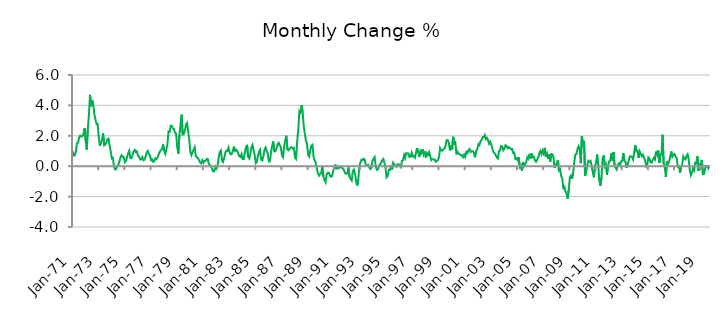
| Category | Series 0 |
|---|---|
| 1971-01-01 | 1.014 |
| 1971-02-01 | 0.711 |
| 1971-03-01 | 0.712 |
| 1971-04-01 | 0.919 |
| 1971-05-01 | 1.51 |
| 1971-06-01 | 1.551 |
| 1971-07-01 | 1.878 |
| 1971-08-01 | 2.005 |
| 1971-09-01 | 1.95 |
| 1971-10-01 | 1.987 |
| 1971-11-01 | 2.104 |
| 1971-12-01 | 2.509 |
| 1972-01-01 | 1.699 |
| 1972-02-01 | 1.094 |
| 1972-03-01 | 2.462 |
| 1972-04-01 | 3.36 |
| 1972-05-01 | 4.697 |
| 1972-06-01 | 3.937 |
| 1972-07-01 | 4.355 |
| 1972-08-01 | 4.026 |
| 1972-09-01 | 3.417 |
| 1972-10-01 | 3.088 |
| 1972-11-01 | 2.774 |
| 1972-12-01 | 2.784 |
| 1973-01-01 | 1.938 |
| 1973-02-01 | 1.343 |
| 1973-03-01 | 1.524 |
| 1973-04-01 | 1.712 |
| 1973-05-01 | 2.158 |
| 1973-06-01 | 1.373 |
| 1973-07-01 | 1.418 |
| 1973-08-01 | 1.551 |
| 1973-09-01 | 1.782 |
| 1973-10-01 | 1.816 |
| 1973-11-01 | 1.359 |
| 1973-12-01 | 0.961 |
| 1974-01-01 | 0.511 |
| 1974-02-01 | 0.548 |
| 1974-03-01 | -0.022 |
| 1974-04-01 | -0.216 |
| 1974-05-01 | -0.191 |
| 1974-06-01 | 0.007 |
| 1974-07-01 | 0.097 |
| 1974-08-01 | 0.326 |
| 1974-09-01 | 0.591 |
| 1974-10-01 | 0.722 |
| 1974-11-01 | 0.594 |
| 1974-12-01 | 0.583 |
| 1975-01-01 | 0.268 |
| 1975-02-01 | 0.337 |
| 1975-03-01 | 0.597 |
| 1975-04-01 | 0.845 |
| 1975-05-01 | 1.017 |
| 1975-06-01 | 0.539 |
| 1975-07-01 | 0.526 |
| 1975-08-01 | 0.722 |
| 1975-09-01 | 0.97 |
| 1975-10-01 | 1.067 |
| 1975-11-01 | 0.93 |
| 1975-12-01 | 0.985 |
| 1976-01-01 | 0.687 |
| 1976-02-01 | 0.643 |
| 1976-03-01 | 0.437 |
| 1976-04-01 | 0.463 |
| 1976-05-01 | 0.603 |
| 1976-06-01 | 0.392 |
| 1976-07-01 | 0.432 |
| 1976-08-01 | 0.636 |
| 1976-09-01 | 0.905 |
| 1976-10-01 | 1.011 |
| 1976-11-01 | 0.8 |
| 1976-12-01 | 0.709 |
| 1977-01-01 | 0.392 |
| 1977-02-01 | 0.448 |
| 1977-03-01 | 0.289 |
| 1977-04-01 | 0.338 |
| 1977-05-01 | 0.521 |
| 1977-06-01 | 0.47 |
| 1977-07-01 | 0.575 |
| 1977-08-01 | 0.784 |
| 1977-09-01 | 0.951 |
| 1977-10-01 | 1.061 |
| 1977-11-01 | 1.111 |
| 1977-12-01 | 1.434 |
| 1978-01-01 | 1.05 |
| 1978-02-01 | 0.811 |
| 1978-03-01 | 1.084 |
| 1978-04-01 | 1.443 |
| 1978-05-01 | 2.28 |
| 1978-06-01 | 2.255 |
| 1978-07-01 | 2.668 |
| 1978-08-01 | 2.665 |
| 1978-09-01 | 2.498 |
| 1978-10-01 | 2.424 |
| 1978-11-01 | 2.207 |
| 1978-12-01 | 2.133 |
| 1979-01-01 | 1.242 |
| 1979-02-01 | 0.823 |
| 1979-03-01 | 2.034 |
| 1979-04-01 | 2.732 |
| 1979-05-01 | 3.394 |
| 1979-06-01 | 2.083 |
| 1979-07-01 | 2.118 |
| 1979-08-01 | 2.335 |
| 1979-09-01 | 2.734 |
| 1979-10-01 | 2.841 |
| 1979-11-01 | 2.3 |
| 1979-12-01 | 1.747 |
| 1980-01-01 | 0.943 |
| 1980-02-01 | 0.726 |
| 1980-03-01 | 0.925 |
| 1980-04-01 | 1.073 |
| 1980-05-01 | 1.242 |
| 1980-06-01 | 0.656 |
| 1980-07-01 | 0.591 |
| 1980-08-01 | 0.543 |
| 1980-09-01 | 0.381 |
| 1980-10-01 | 0.243 |
| 1980-11-01 | 0.186 |
| 1980-12-01 | 0.395 |
| 1981-01-01 | 0.234 |
| 1981-02-01 | 0.354 |
| 1981-03-01 | 0.354 |
| 1981-04-01 | 0.474 |
| 1981-05-01 | 0.478 |
| 1981-06-01 | 0.161 |
| 1981-07-01 | 0.077 |
| 1981-08-01 | 0.019 |
| 1981-09-01 | -0.188 |
| 1981-10-01 | -0.344 |
| 1981-11-01 | -0.317 |
| 1981-12-01 | -0.035 |
| 1982-01-01 | -0.155 |
| 1982-02-01 | 0.068 |
| 1982-03-01 | 0.555 |
| 1982-04-01 | 0.929 |
| 1982-05-01 | 1.031 |
| 1982-06-01 | 0.372 |
| 1982-07-01 | 0.28 |
| 1982-08-01 | 0.532 |
| 1982-09-01 | 0.859 |
| 1982-10-01 | 1.012 |
| 1982-11-01 | 0.998 |
| 1982-12-01 | 1.225 |
| 1983-01-01 | 0.92 |
| 1983-02-01 | 0.783 |
| 1983-03-01 | 0.81 |
| 1983-04-01 | 0.995 |
| 1983-05-01 | 1.293 |
| 1983-06-01 | 1.001 |
| 1983-07-01 | 1.08 |
| 1983-08-01 | 1.015 |
| 1983-09-01 | 0.803 |
| 1983-10-01 | 0.652 |
| 1983-11-01 | 0.611 |
| 1983-12-01 | 0.798 |
| 1984-01-01 | 0.473 |
| 1984-02-01 | 0.478 |
| 1984-03-01 | 0.903 |
| 1984-04-01 | 1.241 |
| 1984-05-01 | 1.404 |
| 1984-06-01 | 0.614 |
| 1984-07-01 | 0.511 |
| 1984-08-01 | 0.774 |
| 1984-09-01 | 1.225 |
| 1984-10-01 | 1.401 |
| 1984-11-01 | 1.068 |
| 1984-12-01 | 0.734 |
| 1985-01-01 | 0.202 |
| 1985-02-01 | 0.279 |
| 1985-03-01 | 0.684 |
| 1985-04-01 | 0.954 |
| 1985-05-01 | 1.079 |
| 1985-06-01 | 0.413 |
| 1985-07-01 | 0.38 |
| 1985-08-01 | 0.656 |
| 1985-09-01 | 1.087 |
| 1985-10-01 | 1.228 |
| 1985-11-01 | 1.02 |
| 1985-12-01 | 0.807 |
| 1986-01-01 | 0.311 |
| 1986-02-01 | 0.317 |
| 1986-03-01 | 0.923 |
| 1986-04-01 | 1.322 |
| 1986-05-01 | 1.629 |
| 1986-06-01 | 0.97 |
| 1986-07-01 | 0.982 |
| 1986-08-01 | 1.161 |
| 1986-09-01 | 1.443 |
| 1986-10-01 | 1.536 |
| 1986-11-01 | 1.373 |
| 1986-12-01 | 1.263 |
| 1987-01-01 | 0.724 |
| 1987-02-01 | 0.595 |
| 1987-03-01 | 1.283 |
| 1987-04-01 | 1.705 |
| 1987-05-01 | 2.003 |
| 1987-06-01 | 1.108 |
| 1987-07-01 | 1.049 |
| 1987-08-01 | 1.142 |
| 1987-09-01 | 1.226 |
| 1987-10-01 | 1.253 |
| 1987-11-01 | 1.16 |
| 1987-12-01 | 1.188 |
| 1988-01-01 | 0.558 |
| 1988-02-01 | 0.478 |
| 1988-03-01 | 1.666 |
| 1988-04-01 | 2.466 |
| 1988-05-01 | 3.62 |
| 1988-06-01 | 3.526 |
| 1988-07-01 | 4.01 |
| 1988-08-01 | 3.546 |
| 1988-09-01 | 2.637 |
| 1988-10-01 | 2.133 |
| 1988-11-01 | 1.68 |
| 1988-12-01 | 1.467 |
| 1989-01-01 | 0.756 |
| 1989-02-01 | 0.634 |
| 1989-03-01 | 1.069 |
| 1989-04-01 | 1.347 |
| 1989-05-01 | 1.408 |
| 1989-06-01 | 0.607 |
| 1989-07-01 | 0.411 |
| 1989-08-01 | 0.192 |
| 1989-09-01 | -0.165 |
| 1989-10-01 | -0.462 |
| 1989-11-01 | -0.618 |
| 1989-12-01 | -0.507 |
| 1990-01-01 | -0.459 |
| 1990-02-01 | -0.019 |
| 1990-03-01 | -0.686 |
| 1990-04-01 | -0.897 |
| 1990-05-01 | -1.058 |
| 1990-06-01 | -0.51 |
| 1990-07-01 | -0.437 |
| 1990-08-01 | -0.428 |
| 1990-09-01 | -0.604 |
| 1990-10-01 | -0.695 |
| 1990-11-01 | -0.649 |
| 1990-12-01 | -0.278 |
| 1991-01-01 | -0.196 |
| 1991-02-01 | 0.105 |
| 1991-03-01 | -0.159 |
| 1991-04-01 | -0.105 |
| 1991-05-01 | -0.139 |
| 1991-06-01 | -0.062 |
| 1991-07-01 | -0.066 |
| 1991-08-01 | -0.093 |
| 1991-09-01 | -0.159 |
| 1991-10-01 | -0.285 |
| 1991-11-01 | -0.467 |
| 1991-12-01 | -0.497 |
| 1992-01-01 | -0.494 |
| 1992-02-01 | -0.076 |
| 1992-03-01 | -0.697 |
| 1992-04-01 | -0.848 |
| 1992-05-01 | -0.944 |
| 1992-06-01 | -0.312 |
| 1992-07-01 | -0.225 |
| 1992-08-01 | -0.473 |
| 1992-09-01 | -1.015 |
| 1992-10-01 | -1.272 |
| 1992-11-01 | -0.873 |
| 1992-12-01 | 0.026 |
| 1993-01-01 | 0.247 |
| 1993-02-01 | 0.437 |
| 1993-03-01 | 0.391 |
| 1993-04-01 | 0.487 |
| 1993-05-01 | 0.413 |
| 1993-06-01 | 0.047 |
| 1993-07-01 | 0.03 |
| 1993-08-01 | 0.082 |
| 1993-09-01 | -0.063 |
| 1993-10-01 | -0.18 |
| 1993-11-01 | -0.118 |
| 1993-12-01 | 0.35 |
| 1994-01-01 | 0.48 |
| 1994-02-01 | 0.595 |
| 1994-03-01 | -0.023 |
| 1994-04-01 | -0.241 |
| 1994-05-01 | -0.212 |
| 1994-06-01 | 0.019 |
| 1994-07-01 | 0.12 |
| 1994-08-01 | 0.247 |
| 1994-09-01 | 0.391 |
| 1994-10-01 | 0.472 |
| 1994-11-01 | 0.222 |
| 1994-12-01 | -0.131 |
| 1995-01-01 | -0.733 |
| 1995-02-01 | -0.635 |
| 1995-03-01 | -0.24 |
| 1995-04-01 | -0.251 |
| 1995-05-01 | 0.043 |
| 1995-06-01 | -0.212 |
| 1995-07-01 | 0.218 |
| 1995-08-01 | 0.097 |
| 1995-09-01 | 0.057 |
| 1995-10-01 | -0.036 |
| 1995-11-01 | 0.126 |
| 1995-12-01 | 0.123 |
| 1996-01-01 | 0.036 |
| 1996-02-01 | -0.061 |
| 1996-03-01 | 0.33 |
| 1996-04-01 | 0.389 |
| 1996-05-01 | 0.736 |
| 1996-06-01 | 0.535 |
| 1996-07-01 | 0.868 |
| 1996-08-01 | 0.833 |
| 1996-09-01 | 0.834 |
| 1996-10-01 | 0.603 |
| 1996-11-01 | 0.635 |
| 1996-12-01 | 0.892 |
| 1997-01-01 | 0.634 |
| 1997-02-01 | 0.672 |
| 1997-03-01 | 0.57 |
| 1997-04-01 | 0.919 |
| 1997-05-01 | 1.19 |
| 1997-06-01 | 0.893 |
| 1997-07-01 | 0.625 |
| 1997-08-01 | 0.99 |
| 1997-09-01 | 0.877 |
| 1997-10-01 | 1.126 |
| 1997-11-01 | 0.779 |
| 1997-12-01 | 0.981 |
| 1998-01-01 | 0.576 |
| 1998-02-01 | 0.861 |
| 1998-03-01 | 0.744 |
| 1998-04-01 | 0.917 |
| 1998-05-01 | 0.646 |
| 1998-06-01 | 0.394 |
| 1998-07-01 | 0.47 |
| 1998-08-01 | 0.438 |
| 1998-09-01 | 0.441 |
| 1998-10-01 | 0.291 |
| 1998-11-01 | 0.339 |
| 1998-12-01 | 0.406 |
| 1999-01-01 | 0.599 |
| 1999-02-01 | 1.189 |
| 1999-03-01 | 1.036 |
| 1999-04-01 | 1.017 |
| 1999-05-01 | 1.102 |
| 1999-06-01 | 1.154 |
| 1999-07-01 | 1.343 |
| 1999-08-01 | 1.715 |
| 1999-09-01 | 1.719 |
| 1999-10-01 | 1.552 |
| 1999-11-01 | 1.038 |
| 1999-12-01 | 1.38 |
| 2000-01-01 | 1.085 |
| 2000-02-01 | 1.936 |
| 2000-03-01 | 1.491 |
| 2000-04-01 | 1.566 |
| 2000-05-01 | 0.781 |
| 2000-06-01 | 0.949 |
| 2000-07-01 | 0.839 |
| 2000-08-01 | 0.775 |
| 2000-09-01 | 0.714 |
| 2000-10-01 | 0.729 |
| 2000-11-01 | 0.596 |
| 2000-12-01 | 0.754 |
| 2001-01-01 | 0.606 |
| 2001-02-01 | 0.935 |
| 2001-03-01 | 0.867 |
| 2001-04-01 | 1.055 |
| 2001-05-01 | 1.127 |
| 2001-06-01 | 0.924 |
| 2001-07-01 | 0.998 |
| 2001-08-01 | 0.985 |
| 2001-09-01 | 0.883 |
| 2001-10-01 | 0.588 |
| 2001-11-01 | 0.997 |
| 2001-12-01 | 1.094 |
| 2002-01-01 | 1.445 |
| 2002-02-01 | 1.384 |
| 2002-03-01 | 1.631 |
| 2002-04-01 | 1.728 |
| 2002-05-01 | 1.918 |
| 2002-06-01 | 1.906 |
| 2002-07-01 | 2.048 |
| 2002-08-01 | 1.783 |
| 2002-09-01 | 1.859 |
| 2002-10-01 | 1.71 |
| 2002-11-01 | 1.477 |
| 2002-12-01 | 1.602 |
| 2003-01-01 | 1.407 |
| 2003-02-01 | 1.139 |
| 2003-03-01 | 0.91 |
| 2003-04-01 | 0.863 |
| 2003-05-01 | 0.726 |
| 2003-06-01 | 0.579 |
| 2003-07-01 | 0.508 |
| 2003-08-01 | 0.993 |
| 2003-09-01 | 1.027 |
| 2003-10-01 | 1.329 |
| 2003-11-01 | 1.273 |
| 2003-12-01 | 1.053 |
| 2004-01-01 | 1.155 |
| 2004-02-01 | 1.378 |
| 2004-03-01 | 1.315 |
| 2004-04-01 | 1.176 |
| 2004-05-01 | 1.263 |
| 2004-06-01 | 1.184 |
| 2004-07-01 | 1.129 |
| 2004-08-01 | 1.135 |
| 2004-09-01 | 0.885 |
| 2004-10-01 | 0.896 |
| 2004-11-01 | 0.481 |
| 2004-12-01 | 0.525 |
| 2005-01-01 | 0.412 |
| 2005-02-01 | 0.601 |
| 2005-03-01 | -0.056 |
| 2005-04-01 | 0.041 |
| 2005-05-01 | -0.312 |
| 2005-06-01 | 0.273 |
| 2005-07-01 | 0.005 |
| 2005-08-01 | 0.13 |
| 2005-09-01 | 0.301 |
| 2005-10-01 | 0.587 |
| 2005-11-01 | 0.481 |
| 2005-12-01 | 0.815 |
| 2006-01-01 | 0.512 |
| 2006-02-01 | 0.839 |
| 2006-03-01 | 0.59 |
| 2006-04-01 | 0.61 |
| 2006-05-01 | 0.39 |
| 2006-06-01 | 0.294 |
| 2006-07-01 | 0.43 |
| 2006-08-01 | 0.57 |
| 2006-09-01 | 0.838 |
| 2006-10-01 | 0.993 |
| 2006-11-01 | 0.782 |
| 2006-12-01 | 1.025 |
| 2007-01-01 | 0.837 |
| 2007-02-01 | 1.203 |
| 2007-03-01 | 0.635 |
| 2007-04-01 | 0.824 |
| 2007-05-01 | 0.476 |
| 2007-06-01 | 0.769 |
| 2007-07-01 | 0.305 |
| 2007-08-01 | 0.796 |
| 2007-09-01 | 0.787 |
| 2007-10-01 | 0.58 |
| 2007-11-01 | -0.112 |
| 2007-12-01 | 0.065 |
| 2008-01-01 | 0.173 |
| 2008-02-01 | 0.401 |
| 2008-03-01 | -0.272 |
| 2008-04-01 | -0.195 |
| 2008-05-01 | -0.647 |
| 2008-06-01 | -0.781 |
| 2008-07-01 | -1.442 |
| 2008-08-01 | -1.364 |
| 2008-09-01 | -1.669 |
| 2008-10-01 | -1.821 |
| 2008-11-01 | -2.138 |
| 2008-12-01 | -1.553 |
| 2009-01-01 | -0.731 |
| 2009-02-01 | -0.621 |
| 2009-03-01 | -0.825 |
| 2009-04-01 | -0.427 |
| 2009-05-01 | 0.213 |
| 2009-06-01 | 0.764 |
| 2009-07-01 | 0.798 |
| 2009-08-01 | 1.133 |
| 2009-09-01 | 1.32 |
| 2009-10-01 | 1.163 |
| 2009-11-01 | 0.201 |
| 2009-12-01 | 1.966 |
| 2010-01-01 | 1.507 |
| 2010-02-01 | 1.665 |
| 2010-03-01 | -0.631 |
| 2010-04-01 | -0.333 |
| 2010-05-01 | 0.073 |
| 2010-06-01 | 0.35 |
| 2010-07-01 | 0.284 |
| 2010-08-01 | 0.345 |
| 2010-09-01 | -0.014 |
| 2010-10-01 | -0.392 |
| 2010-11-01 | -0.732 |
| 2010-12-01 | -0.005 |
| 2011-01-01 | 0.24 |
| 2011-02-01 | 0.761 |
| 2011-03-01 | 0.093 |
| 2011-04-01 | -0.951 |
| 2011-05-01 | -1.297 |
| 2011-06-01 | -0.711 |
| 2011-07-01 | 0.487 |
| 2011-08-01 | 0.71 |
| 2011-09-01 | -0.012 |
| 2011-10-01 | 0.126 |
| 2011-11-01 | -0.566 |
| 2011-12-01 | 0.032 |
| 2012-01-01 | 0.323 |
| 2012-02-01 | 0.352 |
| 2012-03-01 | 0.849 |
| 2012-04-01 | 0.375 |
| 2012-05-01 | 0.938 |
| 2012-06-01 | 0.004 |
| 2012-07-01 | -0.1 |
| 2012-08-01 | -0.217 |
| 2012-09-01 | 0.1 |
| 2012-10-01 | 0.185 |
| 2012-11-01 | 0.047 |
| 2012-12-01 | 0.311 |
| 2013-01-01 | 0.331 |
| 2013-02-01 | 0.856 |
| 2013-03-01 | 0.368 |
| 2013-04-01 | 0.266 |
| 2013-05-01 | -0.109 |
| 2013-06-01 | 0.137 |
| 2013-07-01 | 0.377 |
| 2013-08-01 | 0.653 |
| 2013-09-01 | 0.637 |
| 2013-10-01 | 0.618 |
| 2013-11-01 | 0.442 |
| 2013-12-01 | 0.903 |
| 2014-01-01 | 1.372 |
| 2014-02-01 | 0.988 |
| 2014-03-01 | 1.017 |
| 2014-04-01 | 0.553 |
| 2014-05-01 | 0.975 |
| 2014-06-01 | 0.817 |
| 2014-07-01 | 0.649 |
| 2014-08-01 | 0.748 |
| 2014-09-01 | 0.573 |
| 2014-10-01 | 0.364 |
| 2014-11-01 | 0.006 |
| 2014-12-01 | 0.136 |
| 2015-01-01 | 0.576 |
| 2015-02-01 | 0.494 |
| 2015-03-01 | 0.259 |
| 2015-04-01 | 0.24 |
| 2015-05-01 | 0.421 |
| 2015-06-01 | 0.552 |
| 2015-07-01 | 0.44 |
| 2015-08-01 | 0.958 |
| 2015-09-01 | 0.755 |
| 2015-10-01 | 1.043 |
| 2015-11-01 | 0.212 |
| 2015-12-01 | 0.764 |
| 2016-01-01 | 0.798 |
| 2016-02-01 | 2.067 |
| 2016-03-01 | 0.169 |
| 2016-04-01 | -0.006 |
| 2016-05-01 | -0.698 |
| 2016-06-01 | 0.334 |
| 2016-07-01 | 0.14 |
| 2016-08-01 | 0.289 |
| 2016-09-01 | 0.636 |
| 2016-10-01 | 0.968 |
| 2016-11-01 | 0.632 |
| 2016-12-01 | 0.743 |
| 2017-01-01 | 0.799 |
| 2017-02-01 | 0.608 |
| 2017-03-01 | 0.525 |
| 2017-04-01 | -0.033 |
| 2017-05-01 | -0.003 |
| 2017-06-01 | -0.431 |
| 2017-07-01 | -0.06 |
| 2017-08-01 | 0.117 |
| 2017-09-01 | 0.643 |
| 2017-10-01 | 0.49 |
| 2017-11-01 | 0.445 |
| 2017-12-01 | 0.678 |
| 2018-01-01 | 0.789 |
| 2018-02-01 | 0.457 |
| 2018-03-01 | -0.281 |
| 2018-04-01 | -0.595 |
| 2018-05-01 | -0.408 |
| 2018-06-01 | -0.109 |
| 2018-07-01 | -0.264 |
| 2018-08-01 | 0.231 |
| 2018-09-01 | 0.19 |
| 2018-10-01 | 0.668 |
| 2018-11-01 | -0.318 |
| 2018-12-01 | 0.119 |
| 2019-01-01 | 0.042 |
| 2019-02-01 | 0.412 |
| 2019-03-01 | -0.523 |
| 2019-04-01 | -0.508 |
| 2019-05-01 | -0.158 |
| 2019-06-01 | 0.024 |
| 2019-07-01 | -0.005 |
| 2019-08-01 | -0.149 |
| 2019-09-01 | 0.038 |